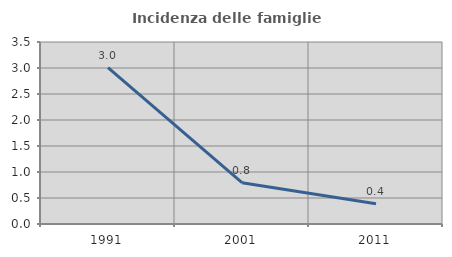
| Category | Incidenza delle famiglie numerose |
|---|---|
| 1991.0 | 3.006 |
| 2001.0 | 0.794 |
| 2011.0 | 0.388 |